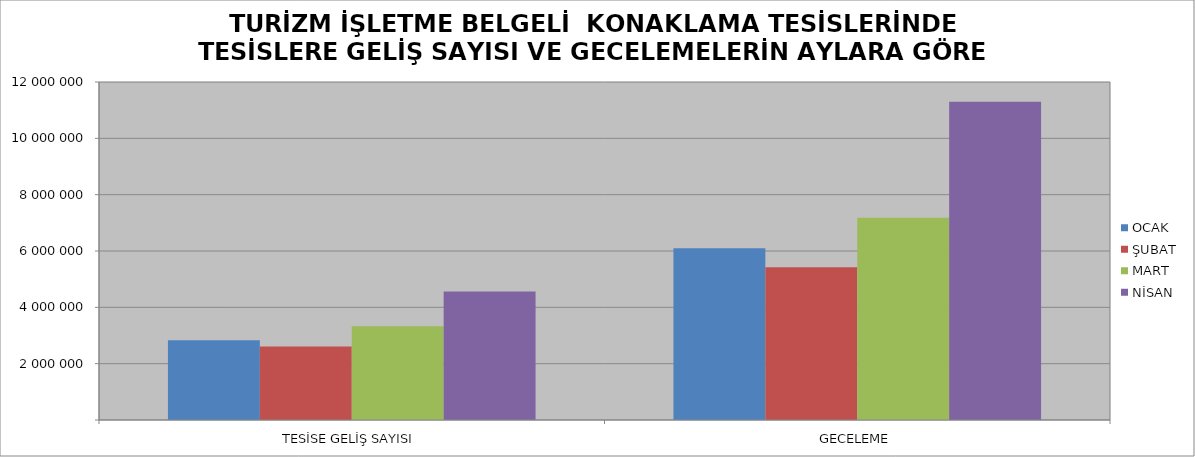
| Category | OCAK | ŞUBAT | MART | NİSAN |
|---|---|---|---|---|
| TESİSE GELİŞ SAYISI | 2833509 | 2607189 | 3326719 | 4561709 |
| GECELEME | 6098050 | 5425989 | 7182593 | 11302946 |